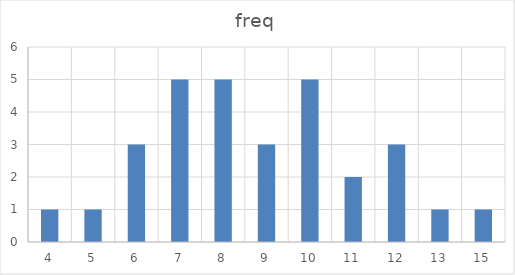
| Category | freq |
|---|---|
| 4.0 | 1 |
| 5.0 | 1 |
| 6.0 | 3 |
| 7.0 | 5 |
| 8.0 | 5 |
| 9.0 | 3 |
| 10.0 | 5 |
| 11.0 | 2 |
| 12.0 | 3 |
| 13.0 | 1 |
| 15.0 | 1 |